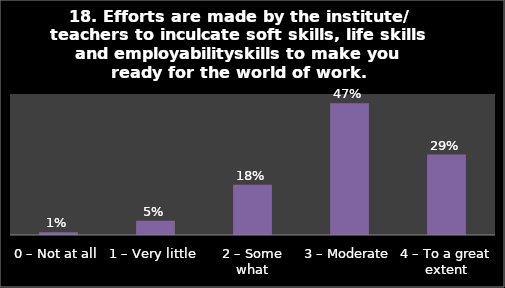
| Category | Series 0 |
|---|---|
| 0 – Not at all | 0.01 |
| 1 – Very little | 0.05 |
| 2 – Some what | 0.179 |
| 3 – Moderate | 0.467 |
| 4 – To a great extent | 0.285 |